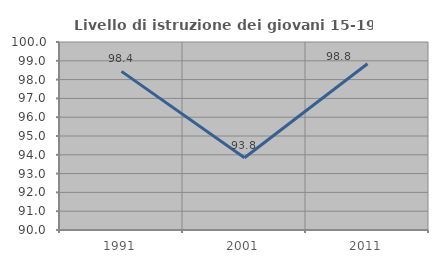
| Category | Livello di istruzione dei giovani 15-19 anni |
|---|---|
| 1991.0 | 98.438 |
| 2001.0 | 93.846 |
| 2011.0 | 98.844 |